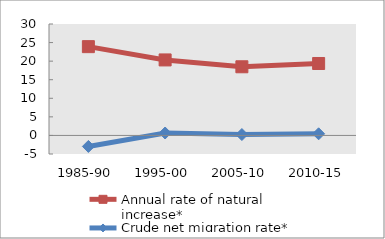
| Category | Annual rate of natural increase* | Crude net migration rate* |
|---|---|---|
| 1985-90 | 23.904 | -2.961 |
| 1995-00 | 20.326 | 0.653 |
| 2005-10 | 18.483 | 0.241 |
| 2010-15 | 19.367 | 0.437 |